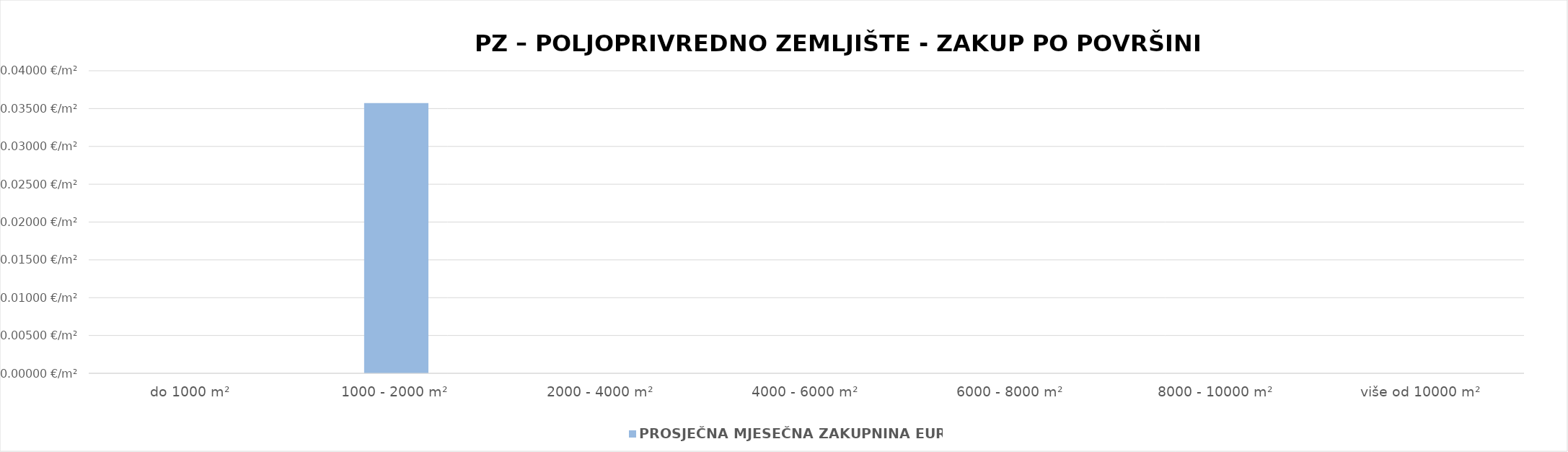
| Category | PROSJEČNA MJESEČNA ZAKUPNINA EUR/m2 |
|---|---|
| do 1000 m² | 0 |
| 1000 - 2000 m² | 0.036 |
| 2000 - 4000 m² | 0 |
| 4000 - 6000 m² | 0 |
| 6000 - 8000 m² | 0 |
| 8000 - 10000 m² | 0 |
| više od 10000 m² | 0 |